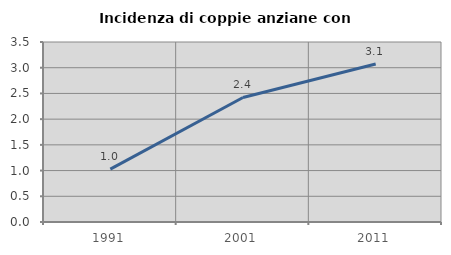
| Category | Incidenza di coppie anziane con figli |
|---|---|
| 1991.0 | 1.028 |
| 2001.0 | 2.422 |
| 2011.0 | 3.073 |